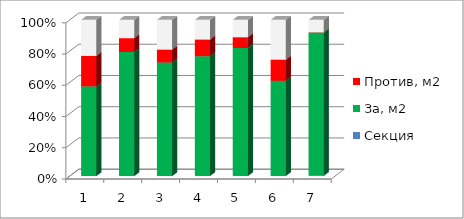
| Category | Секция | За, м2 | Против, м2 | Возд., м2 |
|---|---|---|---|---|
| 0 | 1 | 2020.897 | 685.66 | 813.455 |
| 1 | 2 | 2713.28 | 303.6 | 399.6 |
| 2 | 3 | 2708.169 | 305.5 | 711 |
| 3 | 4 | 2379.32 | 331.72 | 390.84 |
| 4 | 5 | 2952.73 | 246 | 400.27 |
| 5 | 6 | 1439.3 | 319.9 | 604.15 |
| 6 | 7 | 1020.3 | 0 | 90.1 |